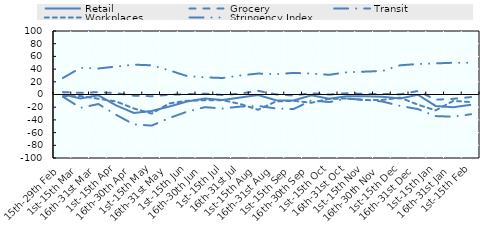
| Category | Retail | Grocery | Transit | Workplaces | Stringency Index |
|---|---|---|---|---|---|
| 15th-29th Feb | 0.19 | 3.8 | -3.5 | -2.7 | 26 |
| 1st-15th Mar | -6.1 | 2.6 | -21 | -2.5 | 42 |
| 16th-31st Mar | -1.3 | 3.7 | -15 | -6.7 | 41 |
| 1st-15th Apr | -17 | 2.2 | -32 | -11 | 44 |
| 16th-30th Apr | -29 | -1.9 | -47 | -22 | 47 |
| 1st-15th May | -26 | -2.7 | -49 | -30 | 46 |
| 16th-31st May | -19 | -0.39 | -37 | -14 | 38 |
| 1st-15th Jun | -11 | 0.58 | -27 | -9.9 | 29 |
| 16th-30th Jun | -6.4 | 1.4 | -20 | -8.9 | 27 |
| 1st-15th Jul | -8.5 | -0.83 | -22 | -8.9 | 26 |
| 16th-31st Jul | -4.8 | 1.5 | -19 | -15 | 30 |
| 1st-15th Aug | -0.74 | 5.8 | -18 | -24 | 33 |
| 16th-31st Aug | -9 | 0.19 | -22 | -11 | 32 |
| 1st-15th Sep | -9.4 | -1.6 | -23 | -9.9 | 34 |
| 16th-30th Sep | -1.4 | 2 | -9.2 | -13 | 33 |
| 1st-15th Oct | -6.6 | -0.15 | -12 | -6.9 | 31 |
| 16th-31st Oct | -2.8 | 1.9 | -6.4 | -6.3 | 35 |
| 1st-15th Nov | -2.7 | 1 | -8.5 | -8.7 | 36 |
| 16th-30th Nov | -3.7 | 0.77 | -11 | -8.5 | 37 |
| 1st-15th Dec | -6.1 | 0.23 | -18 | -5 | 46 |
| 16th-31st Dec | -0.34 | 5.5 | -23 | -16 | 48 |
| 1st-15th Jan | -18 | -8.2 | -34 | -25 | 49 |
| 16th-31st Jan | -20 | -6.8 | -35 | -10 | 50 |
| 1st-15th Feb | -16 | -4 | -31 | -12 | 50 |